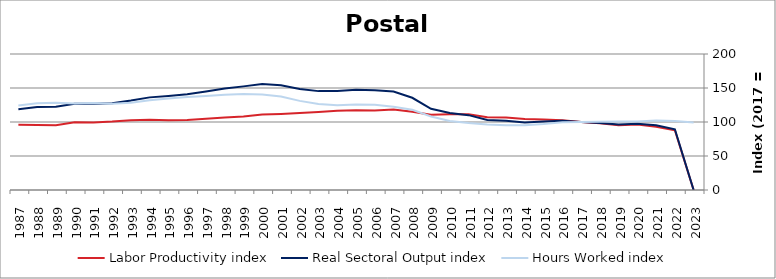
| Category | Labor Productivity index | Real Sectoral Output index | Hours Worked index |
|---|---|---|---|
| 2023.0 | 0 | 0 | 99.121 |
| 2022.0 | 87.921 | 89.242 | 101.502 |
| 2021.0 | 92.968 | 95.114 | 102.309 |
| 2020.0 | 96.385 | 97.249 | 100.897 |
| 2019.0 | 95.393 | 96.156 | 100.8 |
| 2018.0 | 98.098 | 98.581 | 100.492 |
| 2017.0 | 100 | 100 | 100 |
| 2016.0 | 102.559 | 102 | 99.455 |
| 2015.0 | 103.83 | 100.617 | 96.905 |
| 2014.0 | 104.393 | 99.284 | 95.105 |
| 2013.0 | 106.645 | 101.69 | 95.354 |
| 2012.0 | 106.901 | 103.065 | 96.412 |
| 2011.0 | 111.517 | 110.073 | 98.705 |
| 2010.0 | 111.413 | 113.235 | 101.636 |
| 2009.0 | 110.507 | 119.443 | 108.086 |
| 2008.0 | 114.95 | 135.635 | 117.995 |
| 2007.0 | 118.486 | 144.862 | 122.261 |
| 2006.0 | 117.08 | 146.736 | 125.33 |
| 2005.0 | 117.232 | 147.383 | 125.719 |
| 2004.0 | 116.662 | 145.57 | 124.78 |
| 2003.0 | 114.833 | 145.407 | 126.625 |
| 2002.0 | 113.354 | 148.554 | 131.054 |
| 2001.0 | 111.909 | 154.023 | 137.632 |
| 2000.0 | 110.996 | 156.025 | 140.568 |
| 1999.0 | 108.056 | 152.386 | 141.025 |
| 1998.0 | 106.444 | 149.135 | 140.107 |
| 1997.0 | 104.705 | 144.907 | 138.395 |
| 1996.0 | 103.036 | 140.805 | 136.657 |
| 1995.0 | 102.675 | 138.223 | 134.622 |
| 1994.0 | 103.317 | 136.217 | 131.845 |
| 1993.0 | 102.607 | 131.601 | 128.256 |
| 1992.0 | 100.58 | 127.694 | 126.958 |
| 1991.0 | 99.188 | 126.807 | 127.845 |
| 1990.0 | 99.652 | 126.937 | 127.38 |
| 1989.0 | 95.349 | 122.284 | 128.248 |
| 1988.0 | 95.486 | 121.946 | 127.711 |
| 1987.0 | 95.801 | 118.918 | 124.13 |